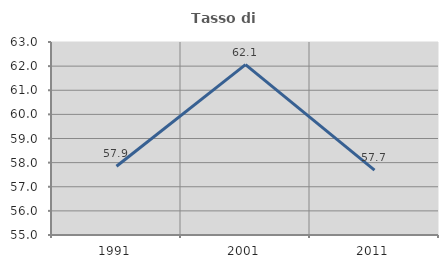
| Category | Tasso di occupazione   |
|---|---|
| 1991.0 | 57.851 |
| 2001.0 | 62.063 |
| 2011.0 | 57.691 |